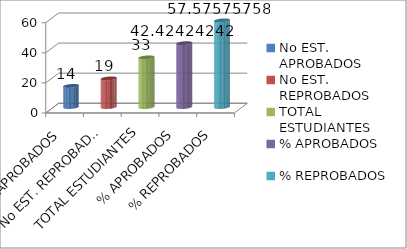
| Category | Series 0 |
|---|---|
| No EST. APROBADOS | 14 |
| No EST. REPROBADOS | 19 |
| TOTAL ESTUDIANTES | 33 |
| % APROBADOS | 42.424 |
| % REPROBADOS | 57.576 |